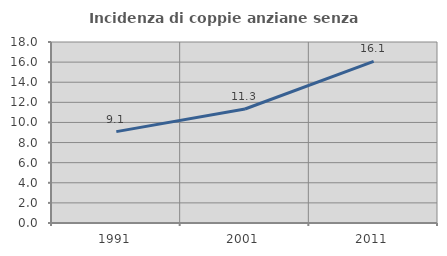
| Category | Incidenza di coppie anziane senza figli  |
|---|---|
| 1991.0 | 9.085 |
| 2001.0 | 11.336 |
| 2011.0 | 16.076 |